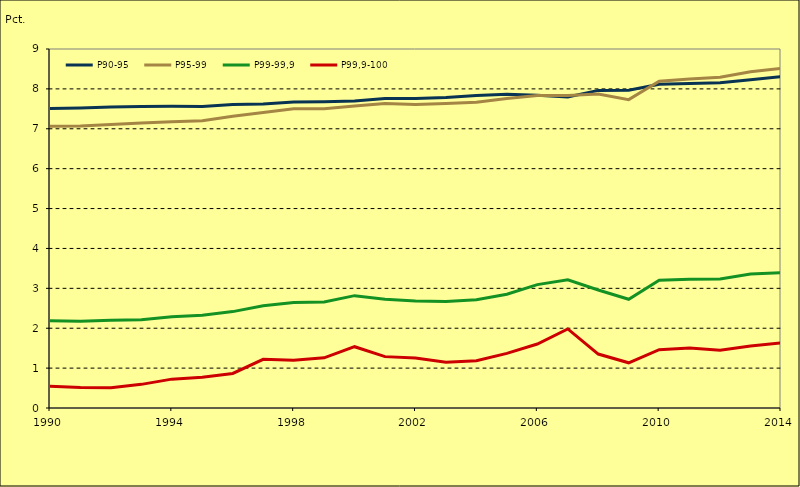
| Category | P90-95 | P95-99 | P99-99,9 | P99,9-100 |
|---|---|---|---|---|
| 1990.0 | 7.507 | 7.062 | 2.185 | 0.546 |
| 1991.0 | 7.521 | 7.07 | 2.174 | 0.514 |
| 1992.0 | 7.544 | 7.11 | 2.199 | 0.51 |
| 1993.0 | 7.559 | 7.143 | 2.21 | 0.593 |
| 1994.0 | 7.562 | 7.173 | 2.29 | 0.723 |
| 1995.0 | 7.557 | 7.201 | 2.326 | 0.768 |
| 1996.0 | 7.61 | 7.311 | 2.416 | 0.867 |
| 1997.0 | 7.623 | 7.409 | 2.562 | 1.221 |
| 1998.0 | 7.67 | 7.499 | 2.645 | 1.2 |
| 1999.0 | 7.677 | 7.502 | 2.655 | 1.258 |
| 2000.0 | 7.694 | 7.57 | 2.817 | 1.537 |
| 2001.0 | 7.762 | 7.632 | 2.728 | 1.288 |
| 2002.0 | 7.76 | 7.608 | 2.684 | 1.255 |
| 2003.0 | 7.787 | 7.631 | 2.669 | 1.147 |
| 2004.0 | 7.833 | 7.663 | 2.715 | 1.183 |
| 2005.0 | 7.867 | 7.757 | 2.85 | 1.368 |
| 2006.0 | 7.843 | 7.833 | 3.093 | 1.603 |
| 2007.0 | 7.797 | 7.833 | 3.212 | 1.982 |
| 2008.0 | 7.962 | 7.874 | 2.958 | 1.352 |
| 2009.0 | 7.966 | 7.731 | 2.726 | 1.133 |
| 2010.0 | 8.115 | 8.192 | 3.205 | 1.461 |
| 2011.0 | 8.137 | 8.248 | 3.225 | 1.501 |
| 2012.0 | 8.153 | 8.292 | 3.233 | 1.446 |
| 2013.0 | 8.228 | 8.43 | 3.361 | 1.556 |
| 2014.0 | 8.304 | 8.512 | 3.394 | 1.63 |